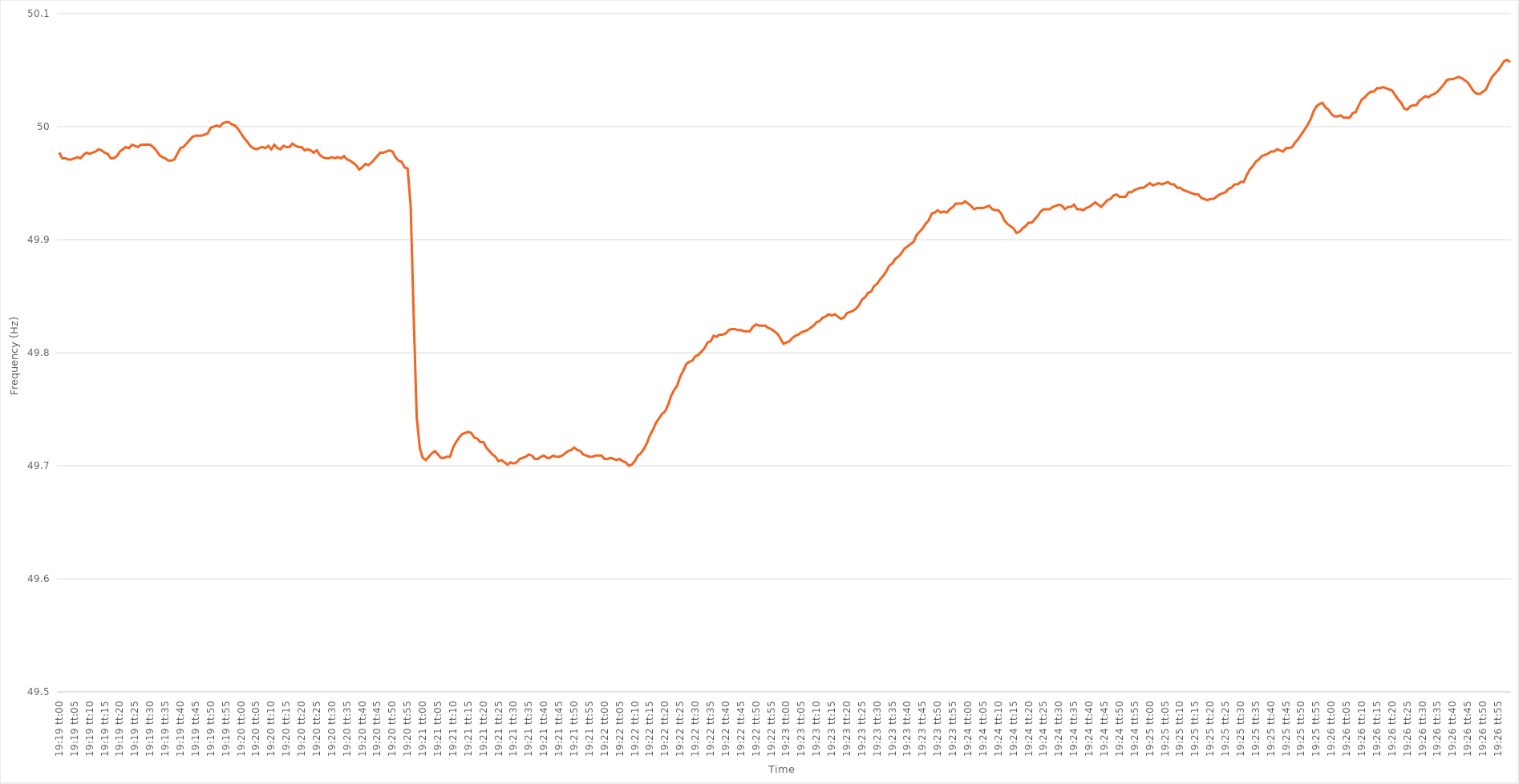
| Category | Series 0 |
|---|---|
| 0.8048611111111111 | 49.977 |
| 0.8048726851851852 | 49.972 |
| 0.8048842592592593 | 49.972 |
| 0.8048958333333333 | 49.971 |
| 0.8049074074074074 | 49.971 |
| 0.8049189814814816 | 49.972 |
| 0.8049305555555556 | 49.973 |
| 0.8049421296296296 | 49.972 |
| 0.8049537037037037 | 49.975 |
| 0.8049652777777778 | 49.977 |
| 0.8049768518518517 | 49.976 |
| 0.8049884259259259 | 49.977 |
| 0.805 | 49.978 |
| 0.8050115740740741 | 49.98 |
| 0.8050231481481481 | 49.979 |
| 0.8050347222222222 | 49.977 |
| 0.8050462962962963 | 49.976 |
| 0.8050578703703705 | 49.972 |
| 0.8050694444444444 | 49.972 |
| 0.8050810185185185 | 49.974 |
| 0.8050925925925926 | 49.978 |
| 0.8051041666666667 | 49.98 |
| 0.8051157407407407 | 49.982 |
| 0.8051273148148148 | 49.981 |
| 0.805138888888889 | 49.984 |
| 0.805150462962963 | 49.983 |
| 0.805162037037037 | 49.982 |
| 0.8051736111111111 | 49.984 |
| 0.8051851851851852 | 49.984 |
| 0.8051967592592592 | 49.984 |
| 0.8052083333333333 | 49.984 |
| 0.8052199074074075 | 49.982 |
| 0.8052314814814815 | 49.979 |
| 0.8052430555555555 | 49.975 |
| 0.8052546296296296 | 49.973 |
| 0.8052662037037037 | 49.972 |
| 0.8052777777777779 | 49.97 |
| 0.8052893518518518 | 49.97 |
| 0.805300925925926 | 49.971 |
| 0.8053125 | 49.976 |
| 0.8053240740740741 | 49.981 |
| 0.8053356481481481 | 49.982 |
| 0.8053472222222222 | 49.985 |
| 0.8053587962962964 | 49.988 |
| 0.8053703703703704 | 49.991 |
| 0.8053819444444444 | 49.992 |
| 0.8053935185185185 | 49.992 |
| 0.8054050925925926 | 49.992 |
| 0.8054166666666666 | 49.993 |
| 0.8054282407407407 | 49.994 |
| 0.8054398148148149 | 49.999 |
| 0.8054513888888889 | 50 |
| 0.8054629629629629 | 50.001 |
| 0.805474537037037 | 50 |
| 0.8054861111111111 | 50.003 |
| 0.8054976851851853 | 50.004 |
| 0.8055092592592592 | 50.004 |
| 0.8055208333333334 | 50.002 |
| 0.8055324074074074 | 50.001 |
| 0.8055439814814815 | 49.998 |
| 0.8055555555555555 | 49.994 |
| 0.8055671296296296 | 49.99 |
| 0.8055787037037038 | 49.987 |
| 0.8055902777777778 | 49.983 |
| 0.8056018518518518 | 49.981 |
| 0.8056134259259259 | 49.98 |
| 0.805625 | 49.981 |
| 0.805636574074074 | 49.982 |
| 0.8056481481481481 | 49.981 |
| 0.8056597222222223 | 49.983 |
| 0.8056712962962963 | 49.98 |
| 0.8056828703703703 | 49.984 |
| 0.8056944444444444 | 49.981 |
| 0.8057060185185185 | 49.98 |
| 0.8057175925925927 | 49.983 |
| 0.8057291666666666 | 49.982 |
| 0.8057407407407408 | 49.982 |
| 0.8057523148148148 | 49.985 |
| 0.805763888888889 | 49.983 |
| 0.8057754629629629 | 49.982 |
| 0.805787037037037 | 49.982 |
| 0.8057986111111112 | 49.979 |
| 0.8058101851851852 | 49.98 |
| 0.8058217592592593 | 49.979 |
| 0.8058333333333333 | 49.977 |
| 0.8058449074074074 | 49.979 |
| 0.8058564814814816 | 49.975 |
| 0.8058680555555555 | 49.973 |
| 0.8058796296296297 | 49.972 |
| 0.8058912037037037 | 49.972 |
| 0.8059027777777777 | 49.973 |
| 0.8059143518518518 | 49.972 |
| 0.8059259259259259 | 49.973 |
| 0.8059375000000001 | 49.972 |
| 0.805949074074074 | 49.974 |
| 0.8059606481481482 | 49.971 |
| 0.8059722222222222 | 49.97 |
| 0.8059837962962964 | 49.968 |
| 0.8059953703703703 | 49.966 |
| 0.8060069444444444 | 49.962 |
| 0.8060185185185186 | 49.964 |
| 0.8060300925925926 | 49.967 |
| 0.8060416666666667 | 49.966 |
| 0.8060532407407407 | 49.968 |
| 0.8060648148148148 | 49.971 |
| 0.806076388888889 | 49.974 |
| 0.8060879629629629 | 49.977 |
| 0.8060995370370371 | 49.977 |
| 0.8061111111111111 | 49.978 |
| 0.8061226851851852 | 49.979 |
| 0.8061342592592592 | 49.978 |
| 0.8061458333333333 | 49.973 |
| 0.8061574074074075 | 49.97 |
| 0.8061689814814814 | 49.969 |
| 0.8061805555555556 | 49.964 |
| 0.8061921296296296 | 49.963 |
| 0.8062037037037038 | 49.93 |
| 0.8062152777777777 | 49.833 |
| 0.8062268518518518 | 49.743 |
| 0.806238425925926 | 49.716 |
| 0.80625 | 49.707 |
| 0.8062615740740741 | 49.705 |
| 0.8062731481481481 | 49.708 |
| 0.8062847222222222 | 49.711 |
| 0.8062962962962964 | 49.713 |
| 0.8063078703703703 | 49.71 |
| 0.8063194444444445 | 49.707 |
| 0.8063310185185185 | 49.707 |
| 0.8063425925925927 | 49.708 |
| 0.8063541666666666 | 49.708 |
| 0.8063657407407407 | 49.716 |
| 0.8063773148148149 | 49.721 |
| 0.8063888888888888 | 49.725 |
| 0.806400462962963 | 49.728 |
| 0.806412037037037 | 49.729 |
| 0.8064236111111112 | 49.73 |
| 0.8064351851851851 | 49.729 |
| 0.8064467592592592 | 49.725 |
| 0.8064583333333334 | 49.724 |
| 0.8064699074074074 | 49.721 |
| 0.8064814814814815 | 49.721 |
| 0.8064930555555555 | 49.716 |
| 0.8065046296296297 | 49.713 |
| 0.8065162037037038 | 49.71 |
| 0.8065277777777777 | 49.708 |
| 0.8065393518518519 | 49.704 |
| 0.8065509259259259 | 49.705 |
| 0.8065625000000001 | 49.703 |
| 0.806574074074074 | 49.701 |
| 0.8065856481481481 | 49.703 |
| 0.8065972222222223 | 49.702 |
| 0.8066087962962962 | 49.703 |
| 0.8066203703703704 | 49.706 |
| 0.8066319444444444 | 49.707 |
| 0.8066435185185186 | 49.708 |
| 0.8066550925925925 | 49.71 |
| 0.8066666666666666 | 49.709 |
| 0.8066782407407408 | 49.706 |
| 0.8066898148148148 | 49.706 |
| 0.8067013888888889 | 49.708 |
| 0.8067129629629629 | 49.709 |
| 0.8067245370370371 | 49.707 |
| 0.8067361111111112 | 49.707 |
| 0.8067476851851851 | 49.709 |
| 0.8067592592592593 | 49.708 |
| 0.8067708333333333 | 49.708 |
| 0.8067824074074075 | 49.709 |
| 0.8067939814814814 | 49.711 |
| 0.8068055555555556 | 49.713 |
| 0.8068171296296297 | 49.714 |
| 0.8068287037037036 | 49.716 |
| 0.8068402777777778 | 49.714 |
| 0.8068518518518518 | 49.713 |
| 0.806863425925926 | 49.71 |
| 0.8068749999999999 | 49.709 |
| 0.806886574074074 | 49.708 |
| 0.8068981481481482 | 49.708 |
| 0.8069097222222222 | 49.709 |
| 0.8069212962962963 | 49.709 |
| 0.8069328703703703 | 49.709 |
| 0.8069444444444445 | 49.706 |
| 0.8069560185185186 | 49.706 |
| 0.8069675925925925 | 49.707 |
| 0.8069791666666667 | 49.706 |
| 0.8069907407407407 | 49.705 |
| 0.8070023148148149 | 49.706 |
| 0.8070138888888888 | 49.704 |
| 0.807025462962963 | 49.703 |
| 0.8070370370370371 | 49.7 |
| 0.807048611111111 | 49.701 |
| 0.8070601851851852 | 49.704 |
| 0.8070717592592592 | 49.709 |
| 0.8070833333333334 | 49.711 |
| 0.8070949074074073 | 49.715 |
| 0.8071064814814815 | 49.72 |
| 0.8071180555555556 | 49.727 |
| 0.8071296296296296 | 49.732 |
| 0.8071412037037037 | 49.738 |
| 0.8071527777777777 | 49.742 |
| 0.8071643518518519 | 49.746 |
| 0.807175925925926 | 49.748 |
| 0.8071875 | 49.754 |
| 0.8071990740740741 | 49.762 |
| 0.8072106481481481 | 49.767 |
| 0.8072222222222223 | 49.771 |
| 0.8072337962962962 | 49.779 |
| 0.8072453703703704 | 49.784 |
| 0.8072569444444445 | 49.79 |
| 0.8072685185185186 | 49.792 |
| 0.8072800925925926 | 49.793 |
| 0.8072916666666666 | 49.797 |
| 0.8073032407407408 | 49.798 |
| 0.8073148148148147 | 49.801 |
| 0.8073263888888889 | 49.804 |
| 0.807337962962963 | 49.809 |
| 0.807349537037037 | 49.81 |
| 0.8073611111111111 | 49.815 |
| 0.8073726851851851 | 49.814 |
| 0.8073842592592593 | 49.816 |
| 0.8073958333333334 | 49.816 |
| 0.8074074074074074 | 49.817 |
| 0.8074189814814815 | 49.82 |
| 0.8074305555555555 | 49.821 |
| 0.8074421296296297 | 49.821 |
| 0.8074537037037036 | 49.82 |
| 0.8074652777777778 | 49.82 |
| 0.8074768518518519 | 49.819 |
| 0.807488425925926 | 49.819 |
| 0.8075 | 49.819 |
| 0.807511574074074 | 49.823 |
| 0.8075231481481482 | 49.825 |
| 0.8075347222222223 | 49.824 |
| 0.8075462962962963 | 49.824 |
| 0.8075578703703704 | 49.824 |
| 0.8075694444444445 | 49.822 |
| 0.8075810185185185 | 49.821 |
| 0.8075925925925925 | 49.819 |
| 0.8076041666666667 | 49.817 |
| 0.8076157407407408 | 49.813 |
| 0.8076273148148148 | 49.808 |
| 0.8076388888888889 | 49.809 |
| 0.807650462962963 | 49.81 |
| 0.8076620370370371 | 49.813 |
| 0.807673611111111 | 49.815 |
| 0.8076851851851852 | 49.816 |
| 0.8076967592592593 | 49.818 |
| 0.8077083333333334 | 49.819 |
| 0.8077199074074074 | 49.82 |
| 0.8077314814814814 | 49.822 |
| 0.8077430555555556 | 49.824 |
| 0.8077546296296297 | 49.827 |
| 0.8077662037037037 | 49.828 |
| 0.8077777777777778 | 49.831 |
| 0.8077893518518519 | 49.832 |
| 0.8078009259259259 | 49.834 |
| 0.8078124999999999 | 49.833 |
| 0.8078240740740741 | 49.834 |
| 0.8078356481481482 | 49.832 |
| 0.8078472222222222 | 49.83 |
| 0.8078587962962963 | 49.831 |
| 0.8078703703703703 | 49.835 |
| 0.8078819444444445 | 49.836 |
| 0.8078935185185184 | 49.837 |
| 0.8079050925925926 | 49.839 |
| 0.8079166666666667 | 49.842 |
| 0.8079282407407408 | 49.847 |
| 0.8079398148148148 | 49.849 |
| 0.8079513888888888 | 49.853 |
| 0.807962962962963 | 49.854 |
| 0.8079745370370371 | 49.859 |
| 0.8079861111111111 | 49.861 |
| 0.8079976851851852 | 49.865 |
| 0.8080092592592593 | 49.868 |
| 0.8080208333333333 | 49.872 |
| 0.8080324074074073 | 49.877 |
| 0.8080439814814815 | 49.879 |
| 0.8080555555555556 | 49.883 |
| 0.8080671296296296 | 49.885 |
| 0.8080787037037037 | 49.888 |
| 0.8080902777777778 | 49.892 |
| 0.8081018518518519 | 49.894 |
| 0.8081134259259258 | 49.896 |
| 0.808125 | 49.898 |
| 0.8081365740740741 | 49.904 |
| 0.8081481481481482 | 49.907 |
| 0.8081597222222222 | 49.91 |
| 0.8081712962962962 | 49.914 |
| 0.8081828703703704 | 49.917 |
| 0.8081944444444445 | 49.923 |
| 0.8082060185185185 | 49.924 |
| 0.8082175925925926 | 49.926 |
| 0.8082291666666667 | 49.924 |
| 0.8082407407407407 | 49.925 |
| 0.8082523148148147 | 49.924 |
| 0.8082638888888889 | 49.927 |
| 0.808275462962963 | 49.929 |
| 0.808287037037037 | 49.932 |
| 0.8082986111111111 | 49.932 |
| 0.8083101851851852 | 49.932 |
| 0.8083217592592593 | 49.934 |
| 0.8083333333333332 | 49.932 |
| 0.8083449074074074 | 49.93 |
| 0.8083564814814815 | 49.927 |
| 0.8083680555555556 | 49.928 |
| 0.8083796296296296 | 49.928 |
| 0.8083912037037037 | 49.928 |
| 0.8084027777777778 | 49.929 |
| 0.808414351851852 | 49.93 |
| 0.8084259259259259 | 49.927 |
| 0.8084375 | 49.926 |
| 0.8084490740740741 | 49.926 |
| 0.8084606481481482 | 49.923 |
| 0.8084722222222221 | 49.917 |
| 0.8084837962962963 | 49.914 |
| 0.8084953703703704 | 49.912 |
| 0.8085069444444444 | 49.91 |
| 0.8085185185185185 | 49.906 |
| 0.8085300925925926 | 49.907 |
| 0.8085416666666667 | 49.91 |
| 0.8085532407407406 | 49.912 |
| 0.8085648148148148 | 49.915 |
| 0.8085763888888889 | 49.915 |
| 0.808587962962963 | 49.918 |
| 0.808599537037037 | 49.921 |
| 0.8086111111111111 | 49.925 |
| 0.8086226851851852 | 49.927 |
| 0.8086342592592594 | 49.927 |
| 0.8086458333333333 | 49.927 |
| 0.8086574074074074 | 49.929 |
| 0.8086689814814815 | 49.93 |
| 0.8086805555555556 | 49.931 |
| 0.8086921296296296 | 49.93 |
| 0.8087037037037037 | 49.927 |
| 0.8087152777777779 | 49.929 |
| 0.8087268518518518 | 49.929 |
| 0.8087384259259259 | 49.931 |
| 0.80875 | 49.927 |
| 0.8087615740740741 | 49.927 |
| 0.808773148148148 | 49.926 |
| 0.8087847222222222 | 49.928 |
| 0.8087962962962963 | 49.929 |
| 0.8088078703703704 | 49.931 |
| 0.8088194444444444 | 49.933 |
| 0.8088310185185185 | 49.931 |
| 0.8088425925925926 | 49.929 |
| 0.8088541666666668 | 49.932 |
| 0.8088657407407407 | 49.935 |
| 0.8088773148148148 | 49.936 |
| 0.8088888888888889 | 49.939 |
| 0.808900462962963 | 49.94 |
| 0.808912037037037 | 49.938 |
| 0.8089236111111111 | 49.938 |
| 0.8089351851851853 | 49.938 |
| 0.8089467592592593 | 49.942 |
| 0.8089583333333333 | 49.942 |
| 0.8089699074074074 | 49.944 |
| 0.8089814814814815 | 49.945 |
| 0.8089930555555555 | 49.946 |
| 0.8090046296296296 | 49.946 |
| 0.8090162037037038 | 49.948 |
| 0.8090277777777778 | 49.95 |
| 0.8090393518518518 | 49.948 |
| 0.8090509259259259 | 49.949 |
| 0.8090625 | 49.95 |
| 0.8090740740740742 | 49.949 |
| 0.8090856481481481 | 49.95 |
| 0.8090972222222222 | 49.951 |
| 0.8091087962962963 | 49.949 |
| 0.8091203703703704 | 49.949 |
| 0.8091319444444444 | 49.946 |
| 0.8091435185185185 | 49.946 |
| 0.8091550925925927 | 49.944 |
| 0.8091666666666667 | 49.943 |
| 0.8091782407407407 | 49.942 |
| 0.8091898148148148 | 49.941 |
| 0.8092013888888889 | 49.94 |
| 0.8092129629629629 | 49.94 |
| 0.809224537037037 | 49.937 |
| 0.8092361111111112 | 49.936 |
| 0.8092476851851852 | 49.935 |
| 0.8092592592592592 | 49.936 |
| 0.8092708333333333 | 49.936 |
| 0.8092824074074074 | 49.938 |
| 0.8092939814814816 | 49.94 |
| 0.8093055555555555 | 49.941 |
| 0.8093171296296297 | 49.942 |
| 0.8093287037037037 | 49.945 |
| 0.8093402777777778 | 49.946 |
| 0.8093518518518518 | 49.949 |
| 0.8093634259259259 | 49.949 |
| 0.8093750000000001 | 49.951 |
| 0.8093865740740741 | 49.951 |
| 0.8093981481481481 | 49.957 |
| 0.8094097222222222 | 49.962 |
| 0.8094212962962963 | 49.965 |
| 0.8094328703703703 | 49.969 |
| 0.8094444444444444 | 49.971 |
| 0.8094560185185186 | 49.974 |
| 0.8094675925925926 | 49.975 |
| 0.8094791666666666 | 49.976 |
| 0.8094907407407407 | 49.978 |
| 0.8095023148148148 | 49.978 |
| 0.809513888888889 | 49.98 |
| 0.8095254629629629 | 49.979 |
| 0.809537037037037 | 49.978 |
| 0.8095486111111111 | 49.981 |
| 0.8095601851851852 | 49.981 |
| 0.8095717592592592 | 49.982 |
| 0.8095833333333333 | 49.986 |
| 0.8095949074074075 | 49.989 |
| 0.8096064814814815 | 49.993 |
| 0.8096180555555555 | 49.997 |
| 0.8096296296296296 | 50.001 |
| 0.8096412037037037 | 50.006 |
| 0.8096527777777777 | 50.013 |
| 0.8096643518518518 | 50.018 |
| 0.809675925925926 | 50.02 |
| 0.8096875 | 50.021 |
| 0.809699074074074 | 50.017 |
| 0.8097106481481481 | 50.015 |
| 0.8097222222222222 | 50.011 |
| 0.8097337962962964 | 50.009 |
| 0.8097453703703703 | 50.009 |
| 0.8097569444444445 | 50.01 |
| 0.8097685185185185 | 50.008 |
| 0.8097800925925926 | 50.008 |
| 0.8097916666666666 | 50.008 |
| 0.8098032407407407 | 50.012 |
| 0.8098148148148149 | 50.013 |
| 0.8098263888888889 | 50.019 |
| 0.809837962962963 | 50.024 |
| 0.809849537037037 | 50.026 |
| 0.8098611111111111 | 50.029 |
| 0.8098726851851853 | 50.031 |
| 0.8098842592592592 | 50.031 |
| 0.8098958333333334 | 50.034 |
| 0.8099074074074074 | 50.034 |
| 0.8099189814814814 | 50.035 |
| 0.8099305555555555 | 50.034 |
| 0.8099421296296296 | 50.033 |
| 0.8099537037037038 | 50.032 |
| 0.8099652777777777 | 50.028 |
| 0.8099768518518519 | 50.024 |
| 0.8099884259259259 | 50.021 |
| 0.81 | 50.016 |
| 0.810011574074074 | 50.015 |
| 0.8100231481481481 | 50.018 |
| 0.8100347222222223 | 50.019 |
| 0.8100462962962963 | 50.019 |
| 0.8100578703703704 | 50.023 |
| 0.8100694444444444 | 50.025 |
| 0.8100810185185185 | 50.027 |
| 0.8100925925925927 | 50.026 |
| 0.8101041666666666 | 50.028 |
| 0.8101157407407408 | 50.029 |
| 0.8101273148148148 | 50.031 |
| 0.810138888888889 | 50.034 |
| 0.8101504629629629 | 50.037 |
| 0.810162037037037 | 50.041 |
| 0.8101736111111112 | 50.042 |
| 0.8101851851851851 | 50.042 |
| 0.8101967592592593 | 50.043 |
| 0.8102083333333333 | 50.044 |
| 0.8102199074074075 | 50.043 |
| 0.8102314814814814 | 50.041 |
| 0.8102430555555555 | 50.039 |
| 0.8102546296296297 | 50.035 |
| 0.8102662037037037 | 50.031 |
| 0.8102777777777778 | 50.029 |
| 0.8102893518518518 | 50.029 |
| 0.810300925925926 | 50.031 |
| 0.8103125000000001 | 50.033 |
| 0.810324074074074 | 50.039 |
| 0.8103356481481482 | 50.044 |
| 0.8103472222222222 | 50.047 |
| 0.8103587962962964 | 50.05 |
| 0.8103703703703703 | 50.054 |
| 0.8103819444444444 | 50.058 |
| 0.8103935185185186 | 50.059 |
| 0.8104050925925925 | 50.057 |